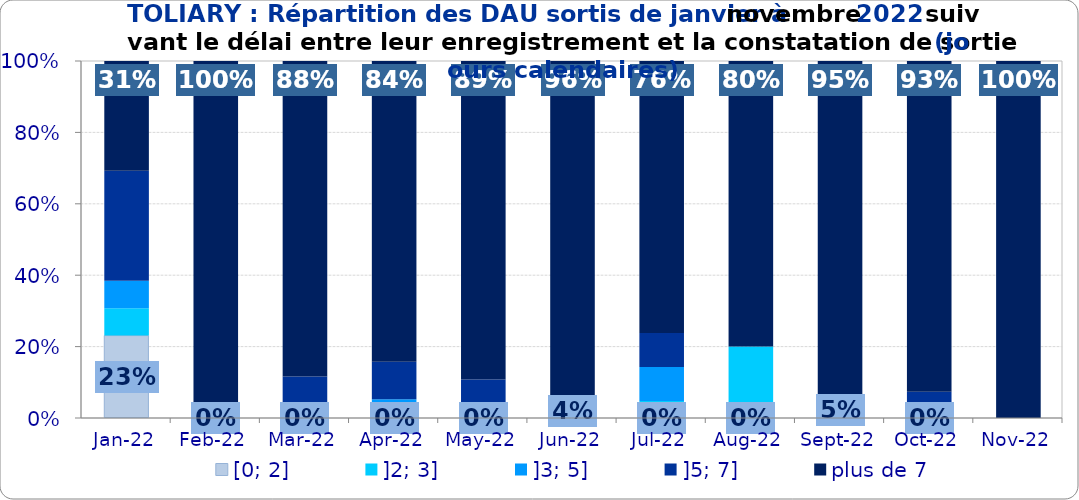
| Category | [0; 2] | ]2; 3] | ]3; 5] | ]5; 7] | plus de 7 |
|---|---|---|---|---|---|
| 2022-01-01 | 0.231 | 0.077 | 0.077 | 0.308 | 0.308 |
| 2022-02-01 | 0 | 0 | 0 | 0 | 1 |
| 2022-03-01 | 0 | 0 | 0.029 | 0.087 | 0.884 |
| 2022-04-01 | 0 | 0 | 0.053 | 0.105 | 0.842 |
| 2022-05-01 | 0 | 0 | 0.015 | 0.092 | 0.892 |
| 2022-06-01 | 0.04 | 0 | 0 | 0 | 0.96 |
| 2022-07-01 | 0 | 0.048 | 0.095 | 0.095 | 0.762 |
| 2022-08-01 | 0 | 0.2 | 0 | 0 | 0.8 |
| 2022-09-01 | 0.048 | 0 | 0 | 0 | 0.952 |
| 2022-10-01 | 0 | 0 | 0 | 0.074 | 0.926 |
| 2022-11-01 | 0 | 0 | 0 | 0 | 1 |